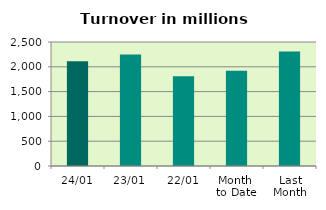
| Category | Series 0 |
|---|---|
| 24/01 | 2109.476 |
| 23/01 | 2247.919 |
| 22/01 | 1809.375 |
| Month 
to Date | 1920.881 |
| Last
Month | 2307.928 |